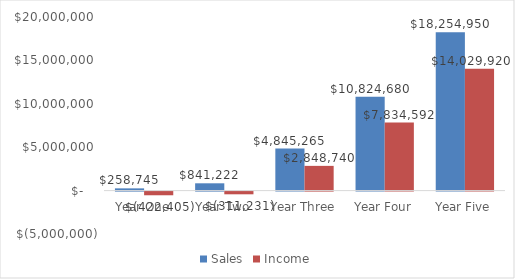
| Category | Sales | Income |
|---|---|---|
|  Year One  | 258745.333 | -422404.667 |
|  Year Two  | 841221.898 | -311230.602 |
|  Year Three  | 4845265.306 | 2848740.306 |
|  Year Four  | 10824679.843 | 7834592.343 |
|  Year Five  | 18254949.572 | 14029919.572 |